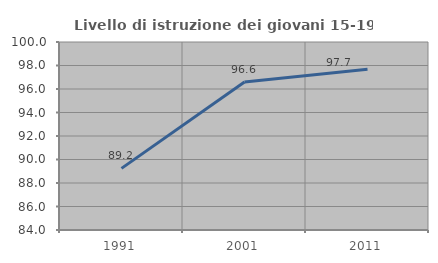
| Category | Livello di istruzione dei giovani 15-19 anni |
|---|---|
| 1991.0 | 89.243 |
| 2001.0 | 96.591 |
| 2011.0 | 97.688 |